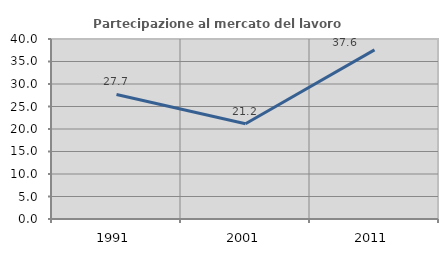
| Category | Partecipazione al mercato del lavoro  femminile |
|---|---|
| 1991.0 | 27.67 |
| 2001.0 | 21.176 |
| 2011.0 | 37.572 |